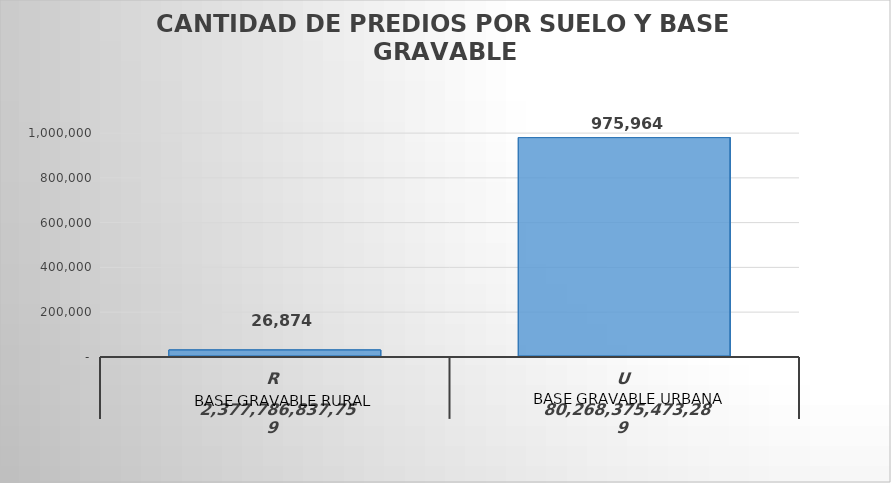
| Category | Predios |
|---|---|
| 0 | 26874 |
| 1 | 975964 |